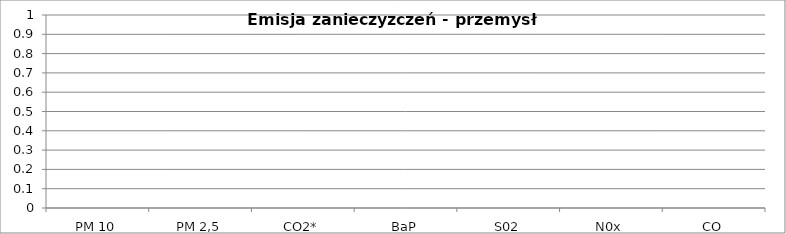
| Category | Series 0 |
|---|---|
| PM 10 | 0 |
| PM 2,5 | 0 |
| CO2* | 0 |
| BaP | 0 |
| S02 | 0 |
| N0x | 0 |
| CO | 0 |